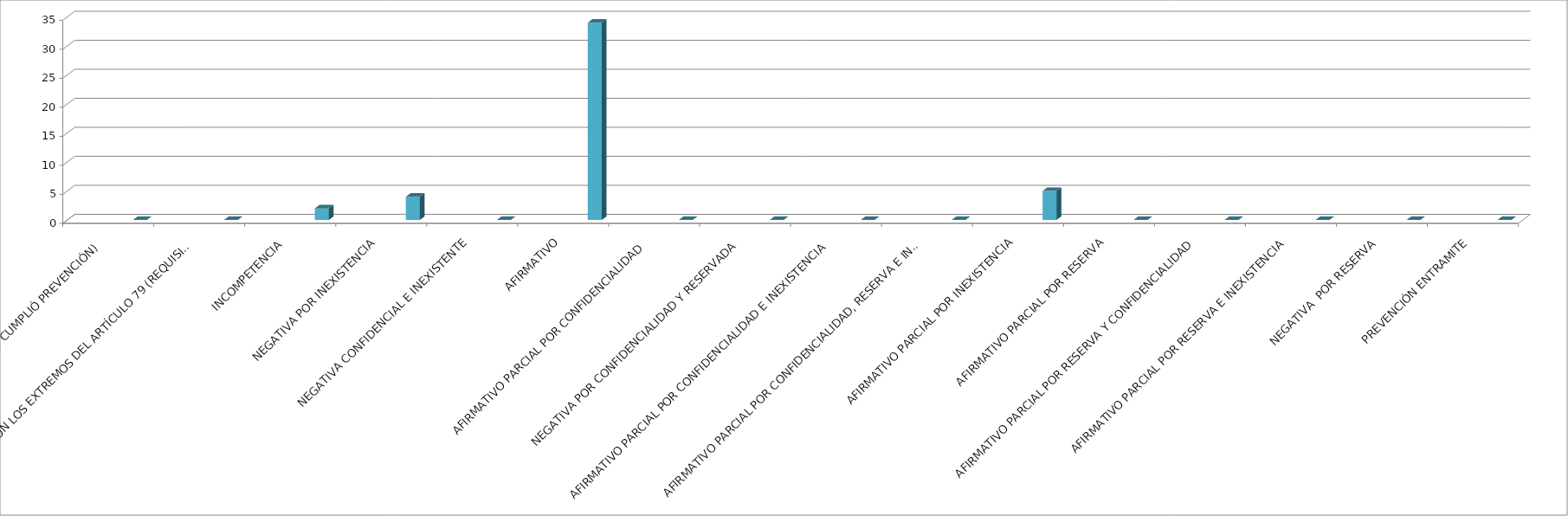
| Category | Series 0 | Series 1 | Series 2 | Series 3 | Series 4 |
|---|---|---|---|---|---|
| SE TIENE POR NO PRESENTADA ( NO CUMPLIÓ PREVENCIÓN) |  |  |  |  | 0 |
| NO CUMPLIO CON LOS EXTREMOS DEL ARTÍCULO 79 (REQUISITOS) |  |  |  |  | 0 |
| INCOMPETENCIA  |  |  |  |  | 2 |
| NEGATIVA POR INEXISTENCIA |  |  |  |  | 4 |
| NEGATIVA CONFIDENCIAL E INEXISTENTE |  |  |  |  | 0 |
| AFIRMATIVO |  |  |  |  | 34 |
| AFIRMATIVO PARCIAL POR CONFIDENCIALIDAD  |  |  |  |  | 0 |
| NEGATIVA POR CONFIDENCIALIDAD Y RESERVADA |  |  |  |  | 0 |
| AFIRMATIVO PARCIAL POR CONFIDENCIALIDAD E INEXISTENCIA |  |  |  |  | 0 |
| AFIRMATIVO PARCIAL POR CONFIDENCIALIDAD, RESERVA E INEXISTENCIA |  |  |  |  | 0 |
| AFIRMATIVO PARCIAL POR INEXISTENCIA |  |  |  |  | 5 |
| AFIRMATIVO PARCIAL POR RESERVA |  |  |  |  | 0 |
| AFIRMATIVO PARCIAL POR RESERVA Y CONFIDENCIALIDAD |  |  |  |  | 0 |
| AFIRMATIVO PARCIAL POR RESERVA E INEXISTENCIA |  |  |  |  | 0 |
| NEGATIVA  POR RESERVA |  |  |  |  | 0 |
| PREVENCIÓN ENTRAMITE |  |  |  |  | 0 |